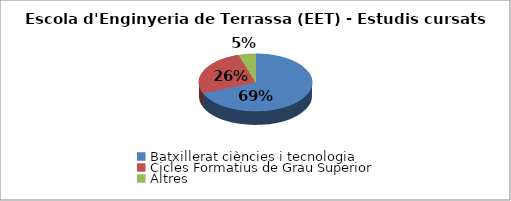
| Category | Escola d'Enginyeria de Terrassa (EET) - Estudis cursats |
|---|---|
| Batxillerat ciències i tecnologia | 0.688 |
| Cicles Formatius de Grau Superior | 0.264 |
| Altres | 0.048 |